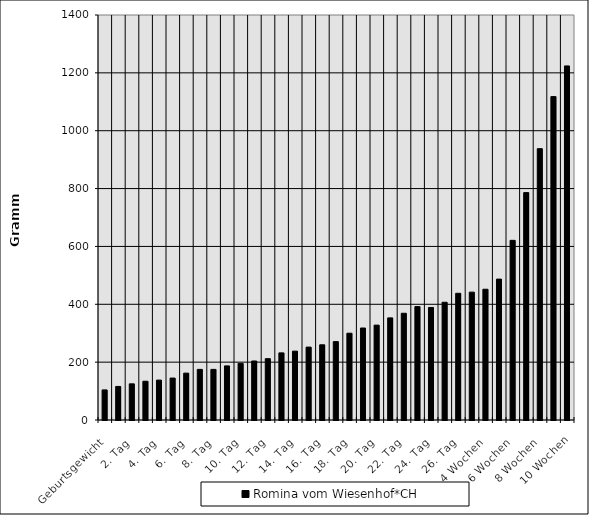
| Category | Romina vom Wiesenhof*CH |
|---|---|
| Geburtsgewicht | 104 |
| 1. Tag | 116 |
| 2. Tag | 125 |
| 3. Tag | 134 |
| 4. Tag | 138 |
| 5. Tag | 145 |
| 6. Tag | 162 |
| 7. Tag | 175 |
| 8. Tag | 175 |
| 9. Tag | 187 |
| 10. Tag | 196 |
| 11. Tag | 204 |
| 12. Tag | 212 |
| 13. Tag | 232 |
| 14. Tag | 238 |
| 15. Tag | 252 |
| 16. Tag | 260 |
| 17. Tag | 271 |
| 18. Tag | 300 |
| 19. Tag | 318 |
| 20. Tag | 328 |
| 21. Tag | 353 |
| 22. Tag | 369 |
| 23. Tag | 392 |
| 24. Tag | 389 |
| 25. Tag | 407 |
| 26. Tag | 438 |
| 27. Tag | 442 |
| 4 Wochen | 452 |
| 5 Wochen | 487 |
| 6 Wochen | 621 |
| 7 Wochen | 786 |
| 8 Wochen | 938 |
| 9 Wochen | 1118 |
| 10 Wochen | 1224 |